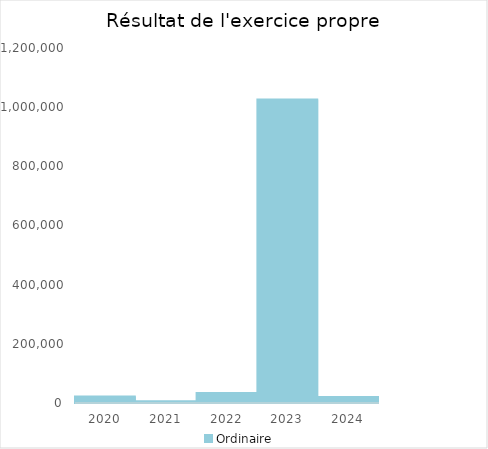
| Category |   | Ordinaire |    |
|---|---|---|---|
| 2020.0 |  | 22288.98 |  |
| 2021.0 |  | 5883.81 |  |
| 2022.0 |  | 33523.16 |  |
| 2023.0 |  | 1025701.84 |  |
| 2024.0 |  | 20216.02 |  |